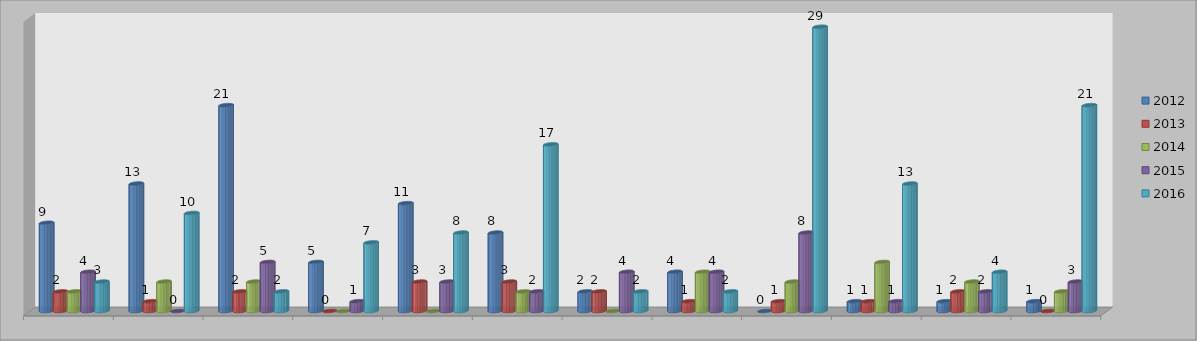
| Category | 2012 | 2013 | 2014 | 2015 | 2016 |
|---|---|---|---|---|---|
|  | 9 | 2 | 2 | 4 | 3 |
|  | 13 | 1 | 3 | 0 | 10 |
|  | 21 | 2 | 3 | 5 | 2 |
|  | 5 | 0 | 0 | 1 | 7 |
|  | 11 | 3 | 0 | 3 | 8 |
|  | 8 | 3 | 2 | 2 | 17 |
|  | 2 | 2 | 0 | 4 | 2 |
|  | 4 | 1 | 4 | 4 | 2 |
|  | 0 | 1 | 3 | 8 | 29 |
|  | 1 | 1 | 5 | 1 | 13 |
|  | 1 | 2 | 3 | 2 | 4 |
|  | 1 | 0 | 2 | 3 | 21 |